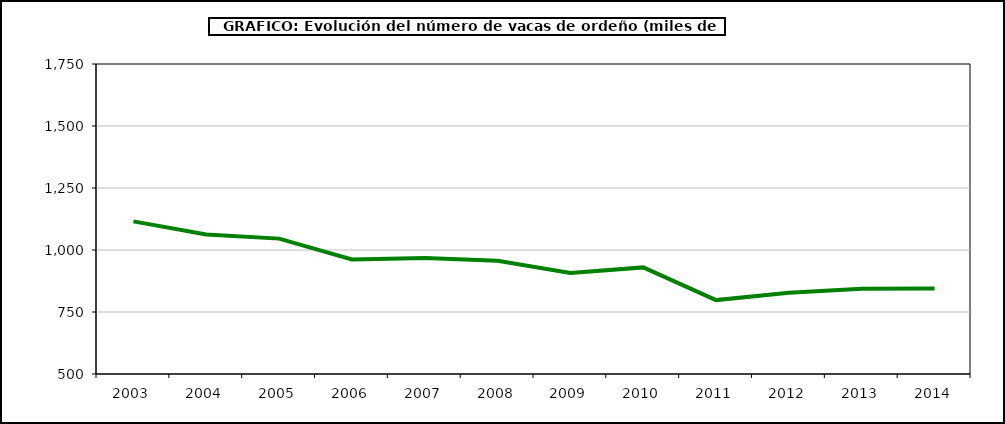
| Category | Leche de vaca |
|---|---|
| 2003.0 | 1115.5 |
| 2004.0 | 1062.5 |
| 2005.0 | 1045.876 |
| 2006.0 | 962 |
| 2007.0 | 967.449 |
| 2008.0 | 956.439 |
| 2009.0 | 907.395 |
| 2010.0 | 929.876 |
| 2011.0 | 798 |
| 2012.0 | 827.207 |
| 2013.0 | 844.059 |
| 2014.0 | 844.791 |